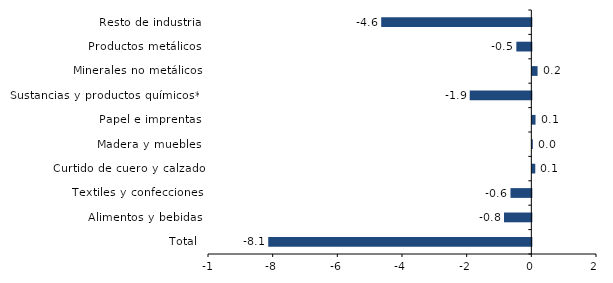
| Category | Series 0 |
|---|---|
| Total | -8.138 |
| Alimentos y bebidas | -0.846 |
| Textiles y confecciones | -0.645 |
| Curtido de cuero y calzado | 0.091 |
| Madera y muebles | 0.015 |
| Papel e imprentas | 0.099 |
| Sustancias y productos químicos** | -1.906 |
| Minerales no metálicos | 0.162 |
| Productos metálicos | -0.464 |
| Resto de industria | -4.643 |